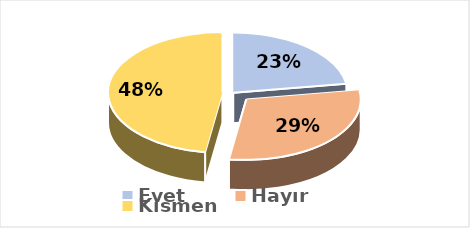
| Category | Evet |
|---|---|
| Evet | 0.226 |
| Hayır | 0.298 |
| Kısmen | 0.476 |